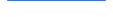
| Category | Series 0 |
|---|---|
| 0 | 6 |
| 1 | 8 |
| 2 | 16 |
| 3 | 12 |
| 4 | 6 |
| 5 | 13 |
| 6 | 10 |
| 7 | 8 |
| 8 | 12 |